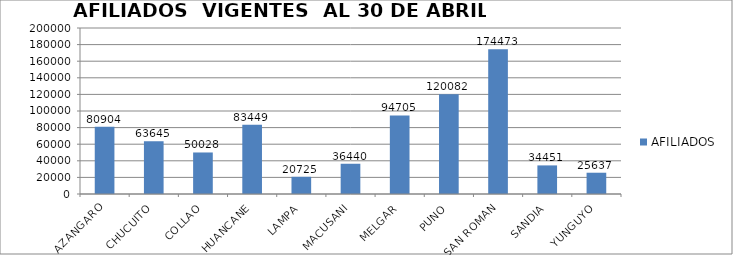
| Category | AFILIADOS |
|---|---|
| AZANGARO | 80904 |
| CHUCUITO | 63645 |
| COLLAO | 50028 |
| HUANCANE | 83449 |
| LAMPA | 20725 |
| MACUSANI | 36440 |
| MELGAR | 94705 |
| PUNO | 120082 |
| SAN ROMAN | 174473 |
| SANDIA | 34451 |
| YUNGUYO | 25637 |